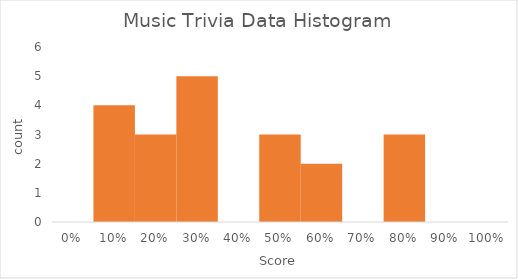
| Category | Series 1 |
|---|---|
| 0.0 | 0 |
| 0.1 | 4 |
| 0.2 | 3 |
| 0.3 | 5 |
| 0.4 | 0 |
| 0.5 | 3 |
| 0.6 | 2 |
| 0.7 | 0 |
| 0.8 | 3 |
| 0.9 | 0 |
| 1.0 | 0 |